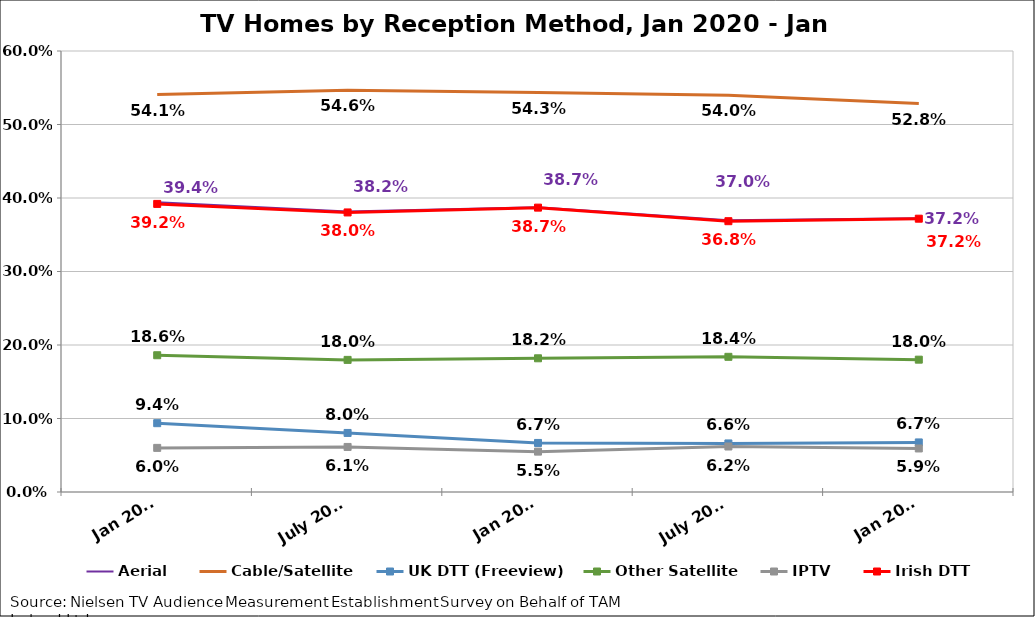
| Category | Aerial | Cable/Satellite | UK DTT (Freeview) | Other Satellite | IPTV | Irish DTT |
|---|---|---|---|---|---|---|
| Jan 2020 | 0.394 | 0.541 | 0.094 | 0.186 | 0.06 | 0.392 |
| July 2020 | 0.382 | 0.546 | 0.08 | 0.18 | 0.061 | 0.38 |
| Jan 2021 | 0.387 | 0.543 | 0.067 | 0.182 | 0.055 | 0.387 |
| July 2021 | 0.37 | 0.54 | 0.066 | 0.184 | 0.062 | 0.368 |
| Jan 2022 | 0.372 | 0.528 | 0.067 | 0.18 | 0.059 | 0.372 |